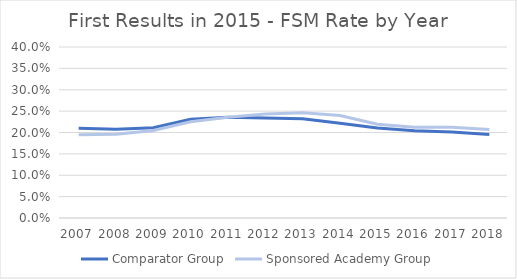
| Category | Comparator Group | Sponsored Academy Group |
|---|---|---|
| 2007.0 | 0.21 | 0.195 |
| 2008.0 | 0.208 | 0.196 |
| 2009.0 | 0.211 | 0.205 |
| 2010.0 | 0.231 | 0.225 |
| 2011.0 | 0.236 | 0.236 |
| 2012.0 | 0.234 | 0.243 |
| 2013.0 | 0.232 | 0.246 |
| 2014.0 | 0.222 | 0.24 |
| 2015.0 | 0.211 | 0.219 |
| 2016.0 | 0.204 | 0.212 |
| 2017.0 | 0.201 | 0.212 |
| 2018.0 | 0.195 | 0.207 |